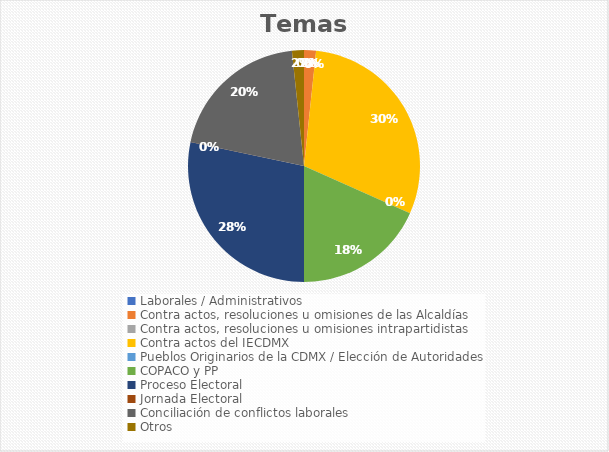
| Category | Temas |
|---|---|
| Laborales / Administrativos | 0 |
| Contra actos, resoluciones u omisiones de las Alcaldías | 1 |
| Contra actos, resoluciones u omisiones intrapartidistas | 0 |
| Contra actos del IECDMX | 18 |
| Pueblos Originarios de la CDMX / Elección de Autoridades | 0 |
| COPACO y PP | 11 |
| Proceso Electoral | 17 |
| Jornada Electoral | 0 |
| Conciliación de conflictos laborales | 12 |
| Otros | 1 |